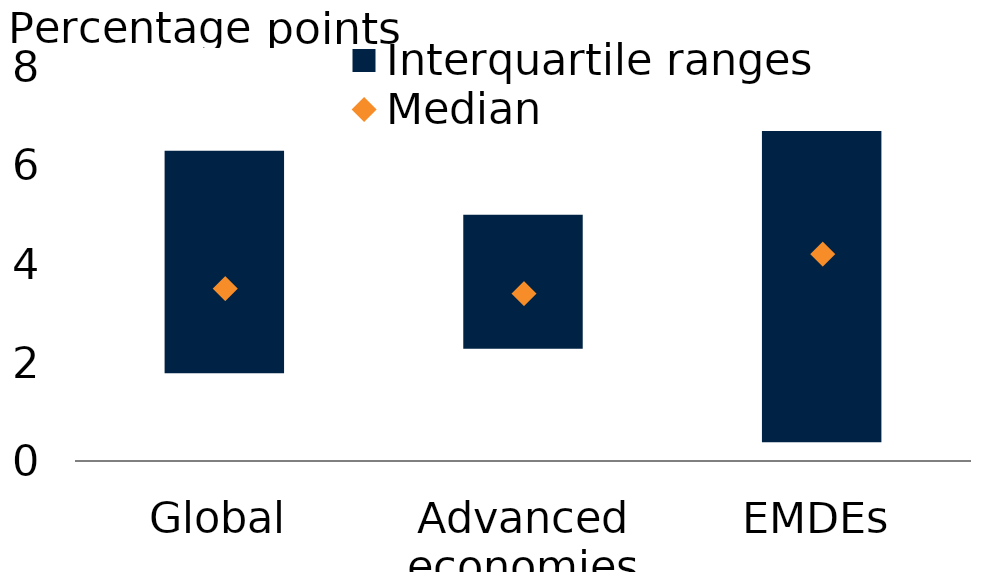
| Category | Lower | Interquartile ranges |
|---|---|---|
| Global | 1.8 | 4.5 |
| Advanced economies | 2.3 | 2.7 |
| EMDEs | 0.4 | 6.3 |